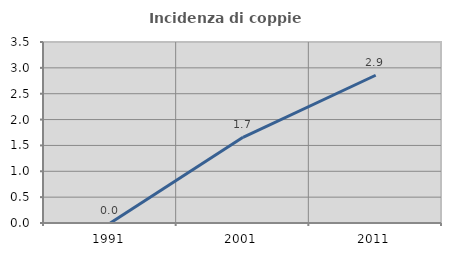
| Category | Incidenza di coppie miste |
|---|---|
| 1991.0 | 0 |
| 2001.0 | 1.657 |
| 2011.0 | 2.857 |